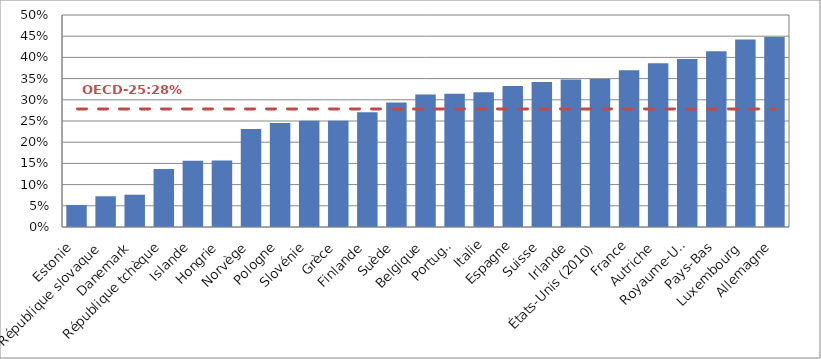
| Category | Series 0 |
|---|---|
| Estonie | 0.052 |
| République slovaque | 0.072 |
| Danemark | 0.076 |
| République tchèque | 0.137 |
| Islande | 0.156 |
| Hongrie | 0.157 |
| Norvège | 0.231 |
| Pologne | 0.246 |
| Slovénie | 0.25 |
| Grèce | 0.251 |
| Finlande | 0.271 |
| Suède | 0.294 |
| Belgique | 0.312 |
| Portugal | 0.315 |
| Italie | 0.318 |
| Espagne | 0.333 |
| Suisse | 0.342 |
| Irlande | 0.348 |
| États-Unis (2010) | 0.349 |
| France | 0.37 |
| Autriche | 0.386 |
| Royaume-Uni | 0.396 |
| Pays-Bas | 0.414 |
| Luxembourg | 0.442 |
| Allemagne | 0.448 |